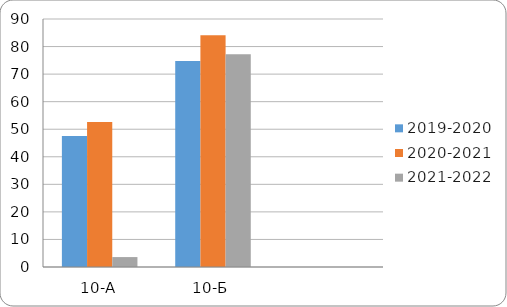
| Category | 2019-2020 | 2020-2021 | 2021-2022 |
|---|---|---|---|
| 10-А | 47.5 | 52.6 | 3.6 |
| 10-Б | 74.8 | 84.1 | 77.2 |